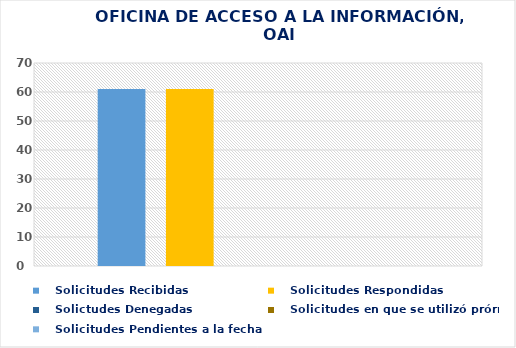
| Category |    Solicitudes Recibidas |    Solicitudes Respondidas |    Solictudes Denegadas |    Solicitudes en que se utilizó prórroga |    Solicitudes Pendientes a la fecha |
|---|---|---|---|---|---|
| 0 | 61 | 61 | 0 | 0 | 0 |